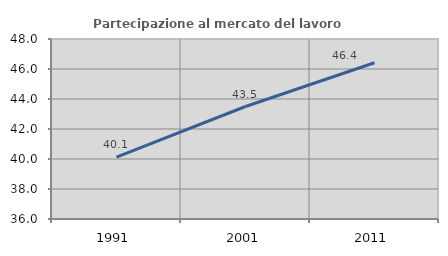
| Category | Partecipazione al mercato del lavoro  femminile |
|---|---|
| 1991.0 | 40.123 |
| 2001.0 | 43.499 |
| 2011.0 | 46.414 |